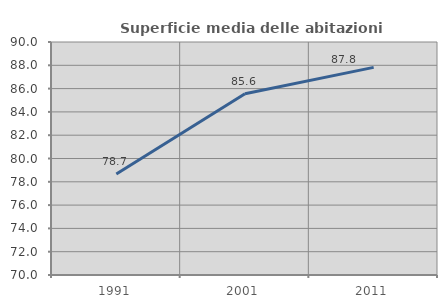
| Category | Superficie media delle abitazioni occupate |
|---|---|
| 1991.0 | 78.664 |
| 2001.0 | 85.562 |
| 2011.0 | 87.824 |